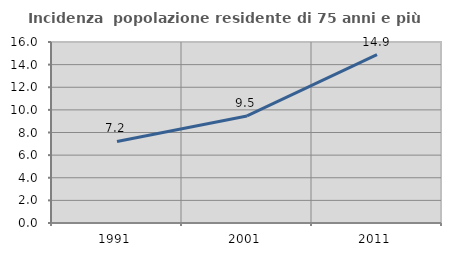
| Category | Incidenza  popolazione residente di 75 anni e più |
|---|---|
| 1991.0 | 7.208 |
| 2001.0 | 9.467 |
| 2011.0 | 14.884 |